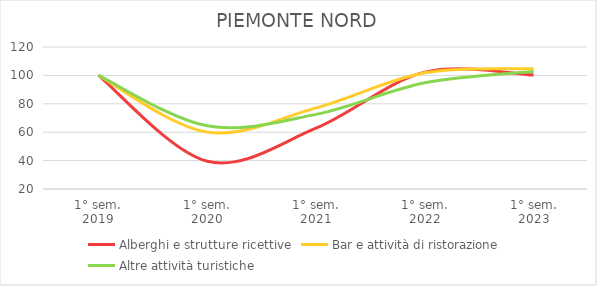
| Category | Alberghi e strutture ricettive | Bar e attività di ristorazione | Altre attività turistiche |
|---|---|---|---|
| 1° sem.
2019 | 100 | 100 | 100 |
| 1° sem.
2020 | 39.571 | 60.06 | 64.479 |
| 1° sem.
2021 | 62.804 | 77.107 | 72.555 |
| 1° sem.
2022 | 102.289 | 101.845 | 94.763 |
| 1° sem.
2023 | 100.315 | 104.655 | 102.713 |